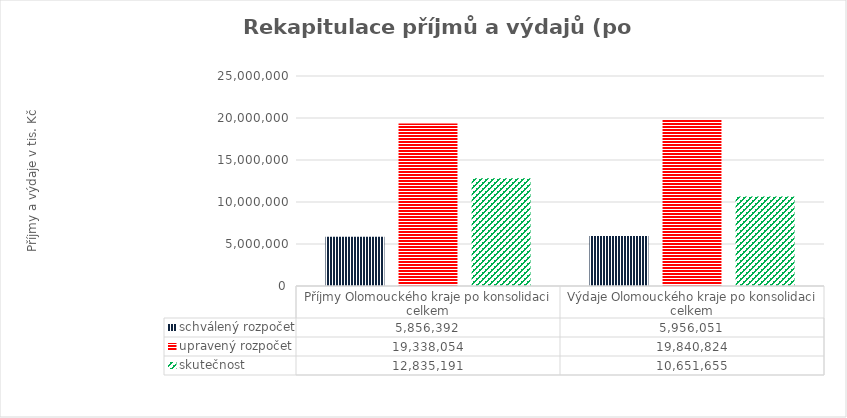
| Category | schválený rozpočet | upravený rozpočet | skutečnost |
|---|---|---|---|
| Příjmy Olomouckého kraje po konsolidaci celkem | 5856392 | 19338054 | 12835191 |
| Výdaje Olomouckého kraje po konsolidaci celkem | 5956051 | 19840824 | 10651655 |